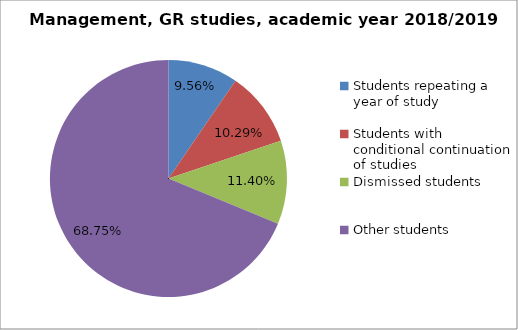
| Category | Series 0 |
|---|---|
| Students repeating a year of study | 26 |
| Students with conditional continuation of studies | 28 |
| Dismissed students | 31 |
| Other students | 187 |